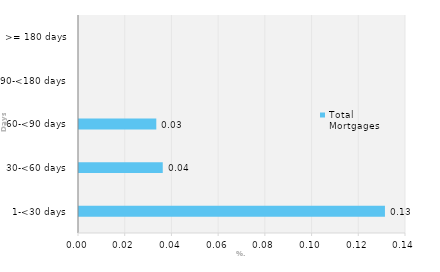
| Category | Total Mortgages |
|---|---|
| 1-<30 days | 0.131 |
| 30-<60 days | 0.036 |
| 60-<90 days | 0.033 |
| 90-<180 days | 0 |
| >= 180 days | 0 |